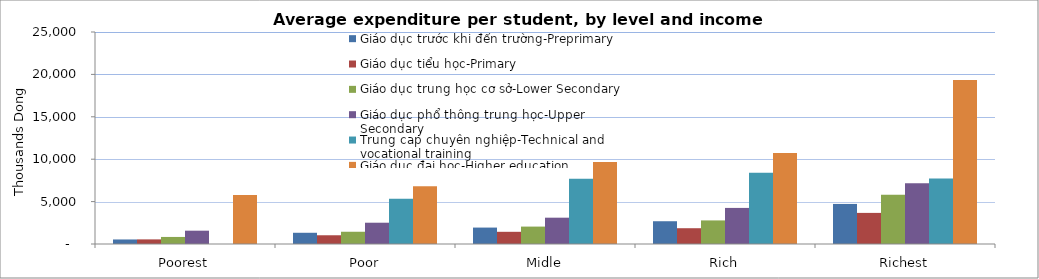
| Category | Giáo dục trước khi đến trường-Preprimary  | Giáo dục tiểu học-Primary  | Giáo dục trung học cơ sở-Lower Secondary | Giáo dục phổ thông trung học-Upper Secondary | Trung cap chuyên nghiệp-Technical and vocational training | Giáo dục đại học-Higher education |
|---|---|---|---|---|---|---|
| Poorest | 535.171 | 544.553 | 832.267 | 1570.38 | 0 | 5779.958 |
| Poor | 1323.802 | 1030.795 | 1444.49 | 2510.518 | 5338.673 | 6822.462 |
| Midle | 1936.935 | 1437.988 | 2053.549 | 3103.954 | 7704.633 | 9660.131 |
| Rich | 2685.104 | 1861.308 | 2781.565 | 4255.247 | 8411.426 | 10740.28 |
| Richest | 4724.396 | 3668.128 | 5813.792 | 7172.095 | 7723.444 | 19351.68 |